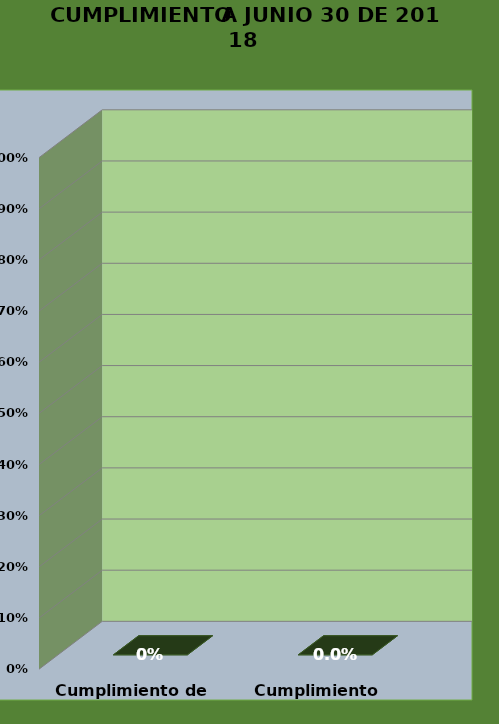
| Category | 30-jun.-18 |
|---|---|
| Cumplimiento de Hitos | 0 |
| Cumplimiento Temporal | 0 |